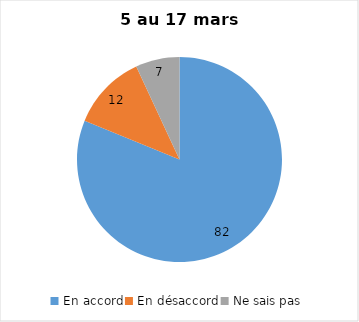
| Category | Series 0 |
|---|---|
| En accord | 82 |
| En désaccord | 12 |
| Ne sais pas | 7 |